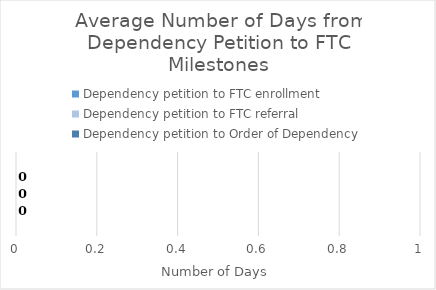
| Category | Dependency petition to FTC enrollment | Dependency petition to FTC referral | Dependency petition to Order of Dependency |
|---|---|---|---|
| 0 | 0 | 0 | 0 |